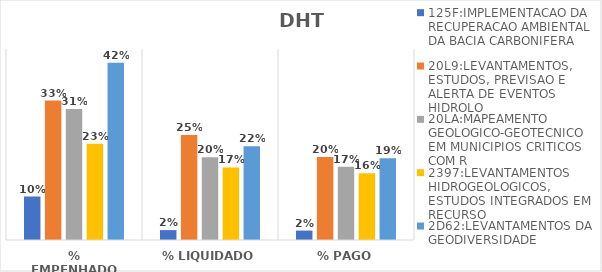
| Category | 125F:IMPLEMENTACAO DA RECUPERACAO AMBIENTAL DA BACIA CARBONIFERA | 20L9:LEVANTAMENTOS, ESTUDOS, PREVISAO E ALERTA DE EVENTOS HIDROLO | 20LA:MAPEAMENTO GEOLOGICO-GEOTECNICO EM MUNICIPIOS CRITICOS COM R | 2397:LEVANTAMENTOS HIDROGEOLOGICOS, ESTUDOS INTEGRADOS EM RECURSO | 2D62:LEVANTAMENTOS DA GEODIVERSIDADE |
|---|---|---|---|---|---|
| % EMPENHADO | 0.102 | 0.329 | 0.309 | 0.227 | 0.418 |
| % LIQUIDADO | 0.023 | 0.247 | 0.195 | 0.171 | 0.221 |
| % PAGO | 0.022 | 0.195 | 0.172 | 0.157 | 0.192 |